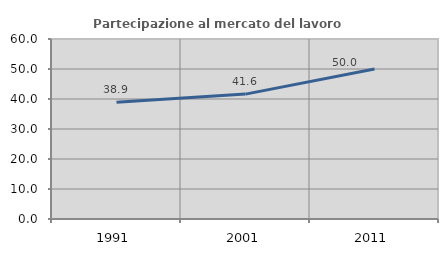
| Category | Partecipazione al mercato del lavoro  femminile |
|---|---|
| 1991.0 | 38.915 |
| 2001.0 | 41.631 |
| 2011.0 | 50 |